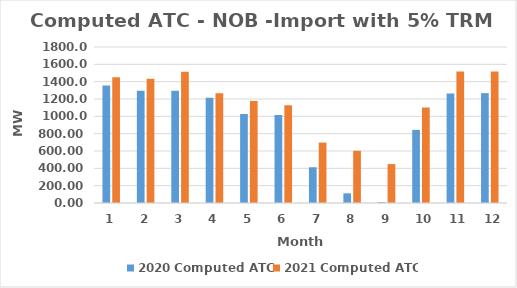
| Category | 2020 Computed ATC | 2021 Computed ATC |
|---|---|---|
| 0 | 1356.9 | 1450.9 |
| 1 | 1295 | 1434.9 |
| 2 | 1294.9 | 1513.9 |
| 3 | 1213.9 | 1265.9 |
| 4 | 1026.9 | 1175.9 |
| 5 | 1016.3 | 1128.9 |
| 6 | 412.32 | 697.2 |
| 7 | 111.46 | 602.2 |
| 8 | 9.88 | 448.9 |
| 9 | 843.32 | 1101.9 |
| 10 | 1262.9 | 1515.9 |
| 11 | 1267.9 | 1515.9 |